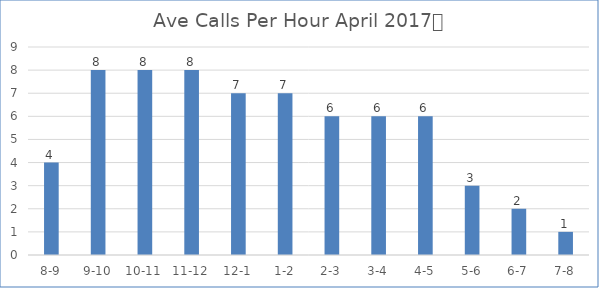
| Category | Ave Calls Per Hour |
|---|---|
| 8-9 | 4 |
| 9-10 | 8 |
| 10-11 | 8 |
| 11-12 | 8 |
| 12-1 | 7 |
| 1-2 | 7 |
| 2-3 | 6 |
| 3-4 | 6 |
| 4-5 | 6 |
| 5-6 | 3 |
| 6-7 | 2 |
| 7-8 | 1 |